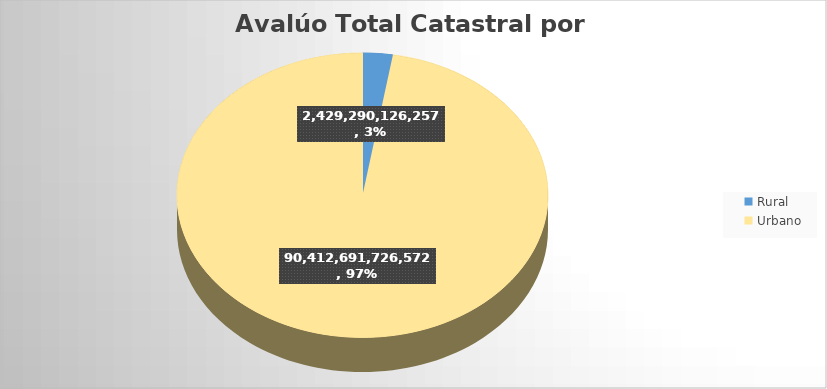
| Category | AvalúoTotal |
|---|---|
| Rural | 2429290126257 |
| Urbano | 90412691726572 |